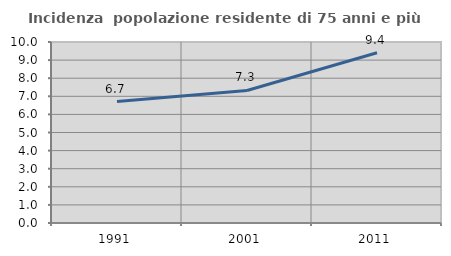
| Category | Incidenza  popolazione residente di 75 anni e più |
|---|---|
| 1991.0 | 6.711 |
| 2001.0 | 7.322 |
| 2011.0 | 9.403 |